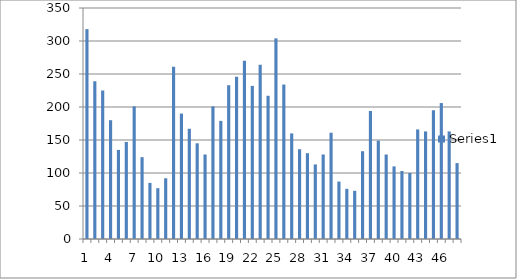
| Category | Series 0 |
|---|---|
| 0 | 318 |
| 1 | 239 |
| 2 | 225 |
| 3 | 180 |
| 4 | 135 |
| 5 | 147 |
| 6 | 201 |
| 7 | 124 |
| 8 | 85 |
| 9 | 77 |
| 10 | 92 |
| 11 | 261 |
| 12 | 190 |
| 13 | 167 |
| 14 | 145 |
| 15 | 128 |
| 16 | 201 |
| 17 | 179 |
| 18 | 233 |
| 19 | 246 |
| 20 | 270 |
| 21 | 232 |
| 22 | 264 |
| 23 | 217 |
| 24 | 304 |
| 25 | 234 |
| 26 | 160 |
| 27 | 136 |
| 28 | 130 |
| 29 | 113 |
| 30 | 128 |
| 31 | 161 |
| 32 | 87 |
| 33 | 76 |
| 34 | 73 |
| 35 | 133 |
| 36 | 194 |
| 37 | 149 |
| 38 | 128 |
| 39 | 110 |
| 40 | 103 |
| 41 | 100 |
| 42 | 166 |
| 43 | 163 |
| 44 | 195 |
| 45 | 206 |
| 46 | 163 |
| 47 | 115 |